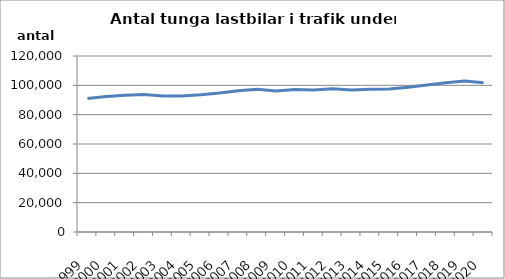
| Category | Series 0 |
|---|---|
| 1999.0 | 91088 |
| 2000.0 | 92349 |
| 2001.0 | 93203 |
| 2002.0 | 93717 |
| 2003.0 | 92752 |
| 2004.0 | 92807 |
| 2005.0 | 93548 |
| 2006.0 | 94702 |
| 2007.0 | 96277 |
| 2008.0 | 97317 |
| 2009.0 | 96187 |
| 2010.0 | 97217 |
| 2011.0 | 96850 |
| 2012.0 | 97661 |
| 2013.0 | 96749 |
| 2014.0 | 97364 |
| 2015.0 | 97469 |
| 2016.0 | 98746 |
| 2017.0 | 100233 |
| 2018.0 | 101773 |
| 2019.0 | 102922 |
| 2020.0 | 101831 |